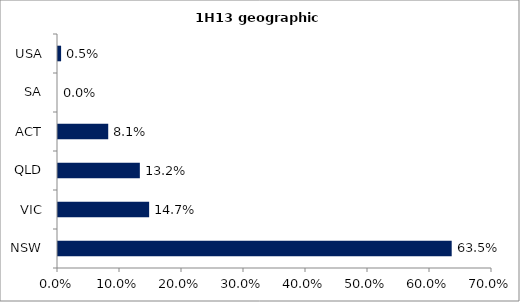
| Category | Series 0 |
|---|---|
| NSW | 0.635 |
| VIC | 0.147 |
| QLD | 0.132 |
| ACT | 0.081 |
| SA | 0 |
| USA | 0.005 |